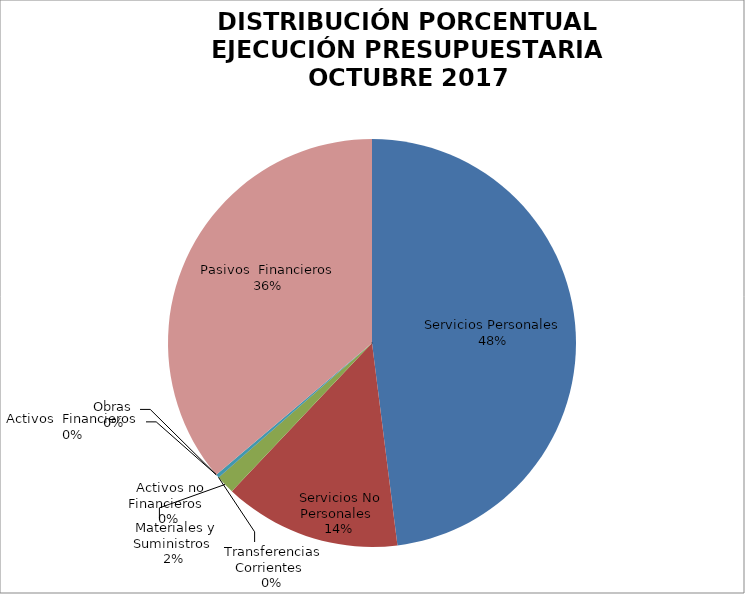
| Category | Series 0 | Series 1 |
|---|---|---|
| Servicios Personales | 11334824.24 | 0.48 |
| Servicios No Personales | 3316471.48 | 0.14 |
| Materiales y Suministros | 353725.95 | 0.015 |
| Transferencias Corrientes | 0 | 0 |
| Activos no Financieros | 64619.63 | 0.003 |
| Obras | 0 | 0 |
| Activos  Financieros | 0 | 0 |
| Pasivos  Financieros | 8540214.13 | 0.362 |